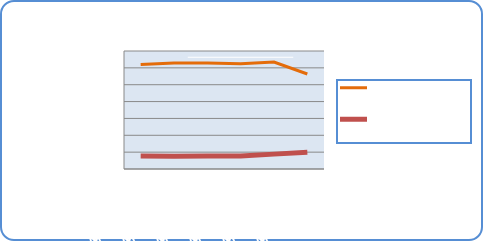
| Category | Motorin Türleri  | Benzin Türleri |
|---|---|---|
| 4/16/18 | 61942209.148 | 7703032.488 |
| 4/17/18 | 62834322.121 | 7583807.24 |
| 4/18/18 | 62950830.269 | 7675789.689 |
| 4/19/18 | 62431727.211 | 7772982.819 |
| 4/20/18 | 63425165.061 | 8823941.644 |
| 4/21/18 | 56348619.503 | 9873528.879 |